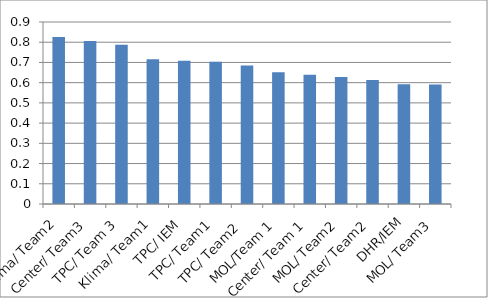
| Category | Series 0 |
|---|---|
| Klima/ Team2 | 0.826 |
| Center/ Team3 | 0.806 |
| TPC/ Team 3 | 0.787 |
| Klima/ Team1 | 0.715 |
| TPC/ IEM | 0.708 |
| TPC/ Team1 | 0.703 |
| TPC/ Team2  | 0.685 |
| MOL/Team 1 | 0.652 |
| Center/ Team 1 | 0.639 |
| MOL/ Team2 | 0.628 |
| Center/ Team2 | 0.614 |
| DHR/IEM | 0.592 |
| MOL/ Team3 | 0.591 |